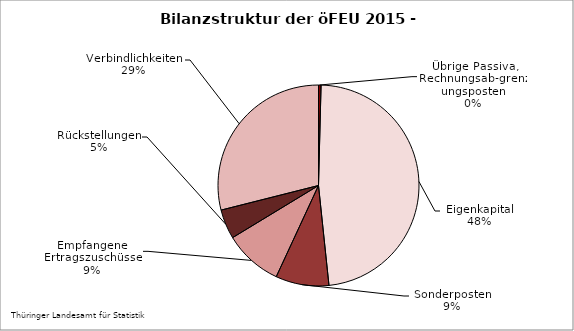
| Category | Series 0 |
|---|---|
| Übrige Passiva, Rechnungsab-grenzungsposten | 0.406 |
| Eigenkapital | 47.93 |
| SoPo mit Rücklageanteil, aus Zuwendungen und anderweitig nicht genannt | 8.568 |
| Empfangene Ertragszuschüsse | 9.41 |
| Rückstellungen | 4.747 |
| Verbindlichkeiten | 28.939 |